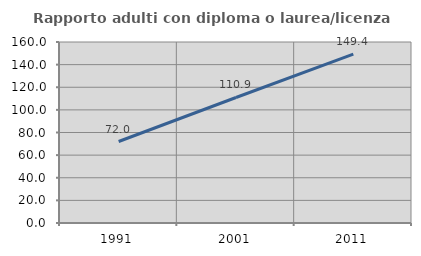
| Category | Rapporto adulti con diploma o laurea/licenza media  |
|---|---|
| 1991.0 | 72.03 |
| 2001.0 | 110.947 |
| 2011.0 | 149.351 |